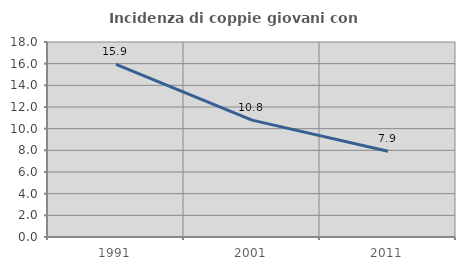
| Category | Incidenza di coppie giovani con figli |
|---|---|
| 1991.0 | 15.926 |
| 2001.0 | 10.79 |
| 2011.0 | 7.919 |